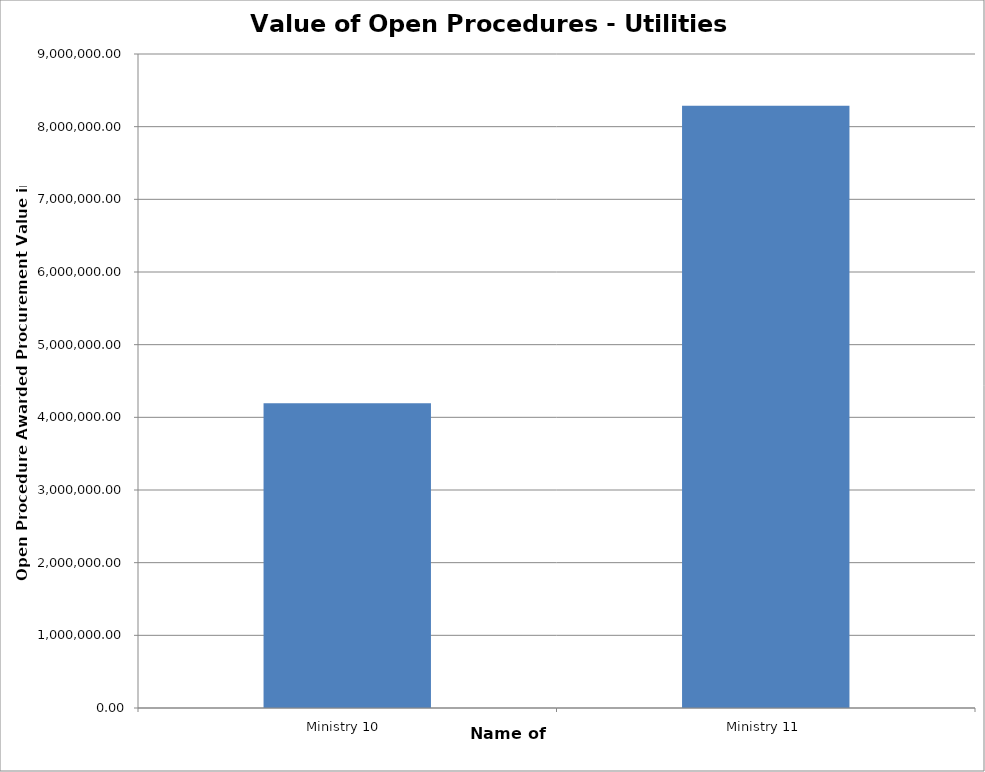
| Category | Series 0 |
|---|---|
| Ministry 10  | 4193505.47 |
| Ministry 11 | 8288891 |